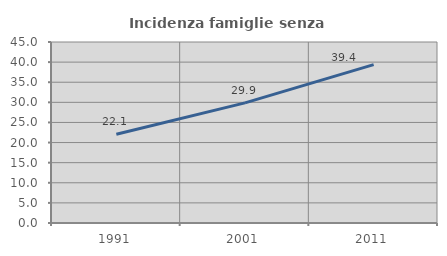
| Category | Incidenza famiglie senza nuclei |
|---|---|
| 1991.0 | 22.059 |
| 2001.0 | 29.866 |
| 2011.0 | 39.36 |